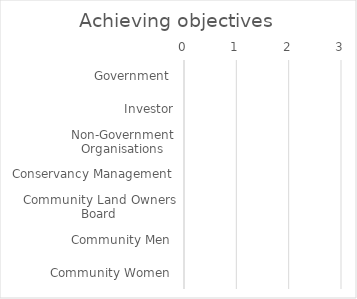
| Category | Achieving objectives |
|---|---|
| Government  | 0 |
| Investor | 0 |
| Non-Government Organisations | 0 |
| Conservancy Management | 0 |
| Community Land Owners Board | 0 |
| Community Men  | 0 |
| Community Women  | 0 |